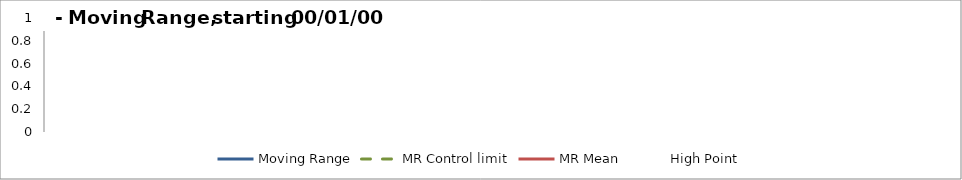
| Category | Moving Range | MR Control limit | MR Mean | High Point |
|---|---|---|---|---|
| 0 | 0 | 0 | 0 | 0 |